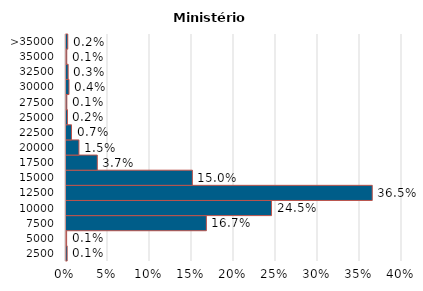
| Category | Ministério Público |
|---|---|
| 2500 | 0.001 |
| 5000 | 0.001 |
| 7500 | 0.167 |
| 10000 | 0.245 |
| 12500 | 0.365 |
| 15000 | 0.15 |
| 17500 | 0.037 |
| 20000 | 0.015 |
| 22500 | 0.007 |
| 25000 | 0.002 |
| 27500 | 0.001 |
| 30000 | 0.004 |
| 32500 | 0.003 |
| 35000 | 0.001 |
| >35000 | 0.002 |